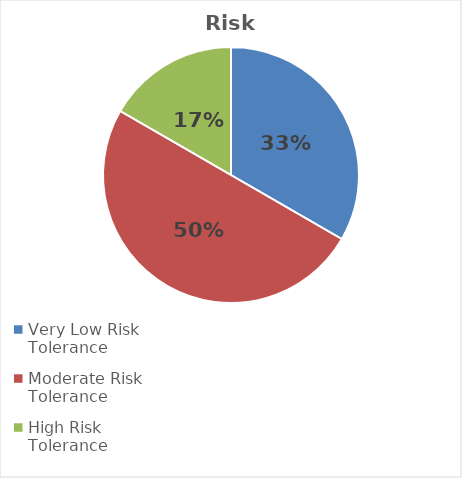
| Category | Series 0 |
|---|---|
| Very Low Risk Tolerance | 0.333 |
| Moderate Risk Tolerance | 0.5 |
| High Risk Tolerance | 0.167 |